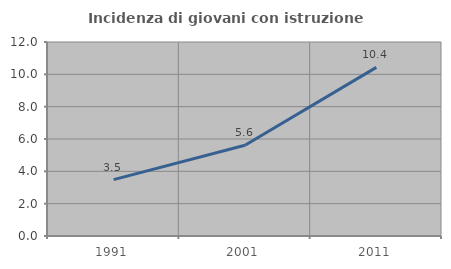
| Category | Incidenza di giovani con istruzione universitaria |
|---|---|
| 1991.0 | 3.488 |
| 2001.0 | 5.613 |
| 2011.0 | 10.433 |